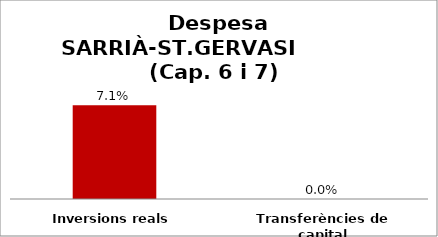
| Category | Series 0 |
|---|---|
| Inversions reals | 0.071 |
| Transferències de capital | 0 |